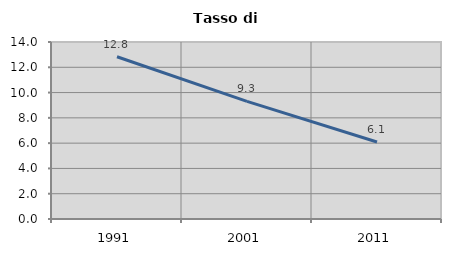
| Category | Tasso di disoccupazione   |
|---|---|
| 1991.0 | 12.831 |
| 2001.0 | 9.308 |
| 2011.0 | 6.092 |